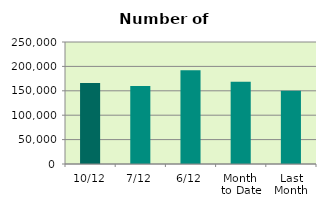
| Category | Series 0 |
|---|---|
| 10/12 | 166072 |
| 7/12 | 159752 |
| 6/12 | 192204 |
| Month 
to Date | 168641.667 |
| Last
Month | 150008.364 |